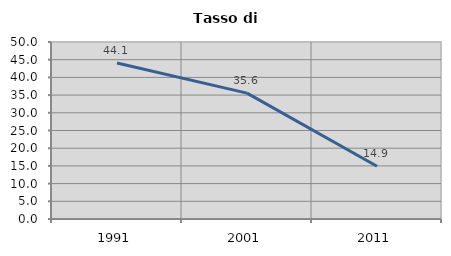
| Category | Tasso di disoccupazione   |
|---|---|
| 1991.0 | 44.055 |
| 2001.0 | 35.556 |
| 2011.0 | 14.912 |